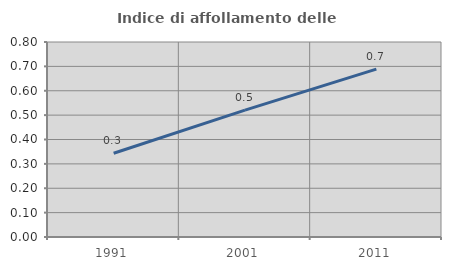
| Category | Indice di affollamento delle abitazioni  |
|---|---|
| 1991.0 | 0.344 |
| 2001.0 | 0.52 |
| 2011.0 | 0.689 |